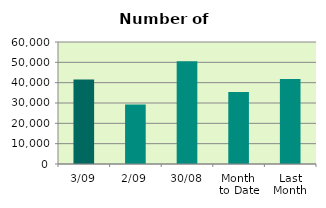
| Category | Series 0 |
|---|---|
| 3/09 | 41514 |
| 2/09 | 29246 |
| 30/08 | 50506 |
| Month 
to Date | 35380 |
| Last
Month | 41849.545 |